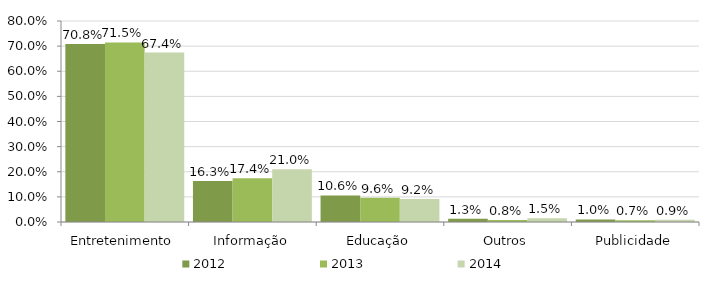
| Category | 2012 | 2013 | 2014 |
|---|---|---|---|
| Entretenimento | 0.708 | 0.715 | 0.674 |
| Informação | 0.163 | 0.174 | 0.21 |
| Educação | 0.106 | 0.096 | 0.092 |
| Outros | 0.013 | 0.008 | 0.015 |
| Publicidade | 0.01 | 0.007 | 0.009 |